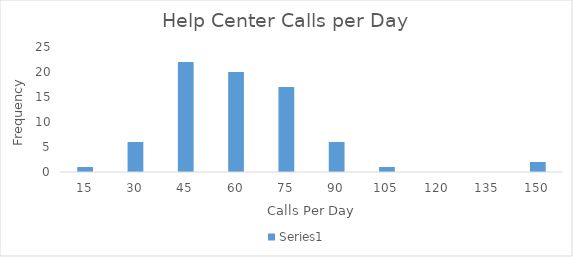
| Category | Series 0 |
|---|---|
| 15.0 | 1 |
| 30.0 | 6 |
| 45.0 | 22 |
| 60.0 | 20 |
| 75.0 | 17 |
| 90.0 | 6 |
| 105.0 | 1 |
| 120.0 | 0 |
| 135.0 | 0 |
| 150.0 | 2 |